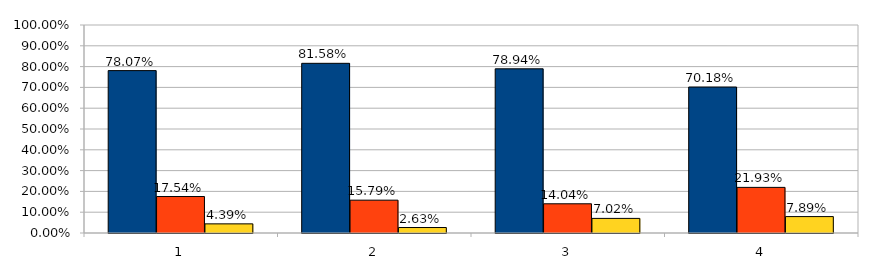
| Category | Хорошо | Удовлетворительно | Неудовлетворительно |
|---|---|---|---|
| 0 | 0.781 | 0.175 | 0.044 |
| 1 | 0.816 | 0.158 | 0.026 |
| 2 | 0.789 | 0.14 | 0.07 |
| 3 | 0.702 | 0.219 | 0.079 |